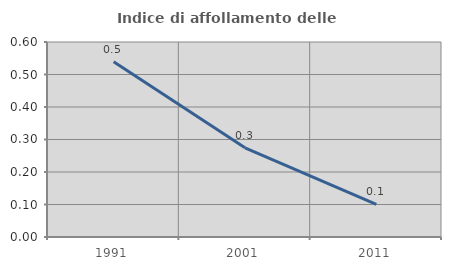
| Category | Indice di affollamento delle abitazioni  |
|---|---|
| 1991.0 | 0.539 |
| 2001.0 | 0.275 |
| 2011.0 | 0.101 |